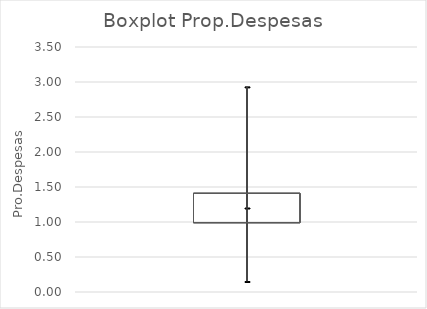
| Category | Series 0 | Series 1 | Series 2 | Series 3 | Series 4 |
|---|---|---|---|---|---|
| 0 | 1.41 | 2.93 | 1.2 | 0.15 | 0.99 |